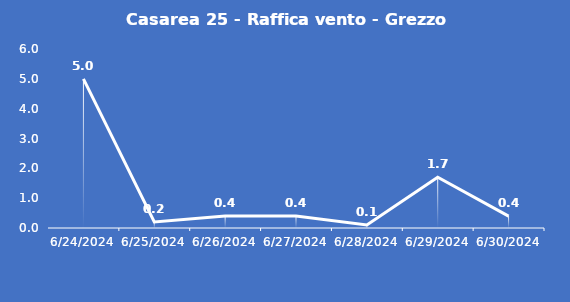
| Category | Casarea 25 - Raffica vento - Grezzo (m/s) |
|---|---|
| 6/24/24 | 5 |
| 6/25/24 | 0.2 |
| 6/26/24 | 0.4 |
| 6/27/24 | 0.4 |
| 6/28/24 | 0.1 |
| 6/29/24 | 1.7 |
| 6/30/24 | 0.4 |